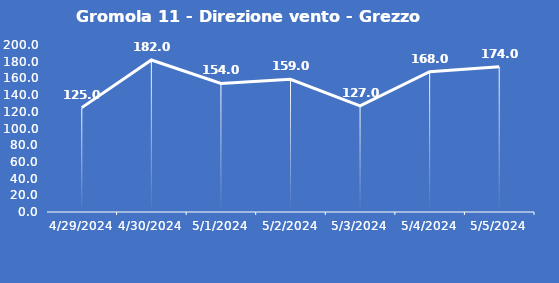
| Category | Gromola 11 - Direzione vento - Grezzo (°N) |
|---|---|
| 4/29/24 | 125 |
| 4/30/24 | 182 |
| 5/1/24 | 154 |
| 5/2/24 | 159 |
| 5/3/24 | 127 |
| 5/4/24 | 168 |
| 5/5/24 | 174 |